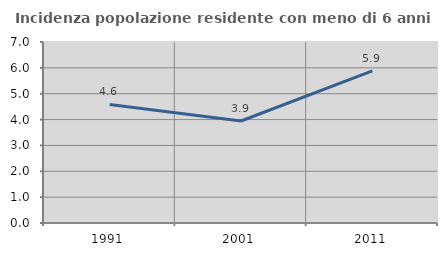
| Category | Incidenza popolazione residente con meno di 6 anni |
|---|---|
| 1991.0 | 4.583 |
| 2001.0 | 3.944 |
| 2011.0 | 5.882 |